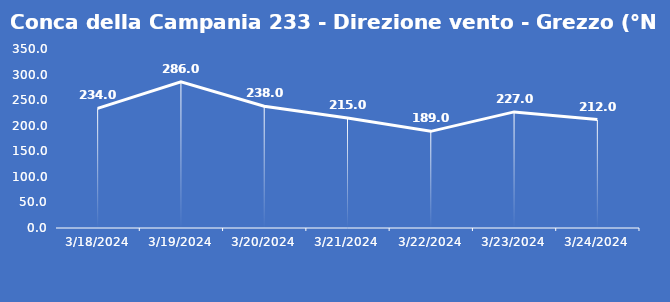
| Category | Conca della Campania 233 - Direzione vento - Grezzo (°N) |
|---|---|
| 3/18/24 | 234 |
| 3/19/24 | 286 |
| 3/20/24 | 238 |
| 3/21/24 | 215 |
| 3/22/24 | 189 |
| 3/23/24 | 227 |
| 3/24/24 | 212 |